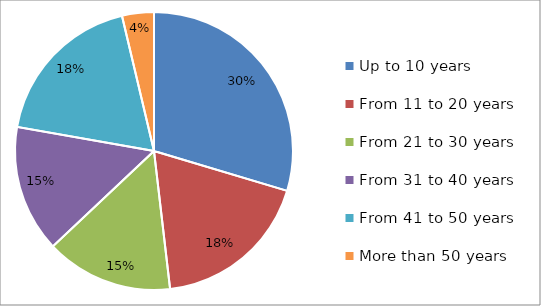
| Category | Series 0 |
|---|---|
| Up to 10 years | 8 |
| From 11 to 20 years | 5 |
| From 21 to 30 years | 4 |
| From 31 to 40 years | 4 |
| From 41 to 50 years | 5 |
| More than 50 years | 1 |